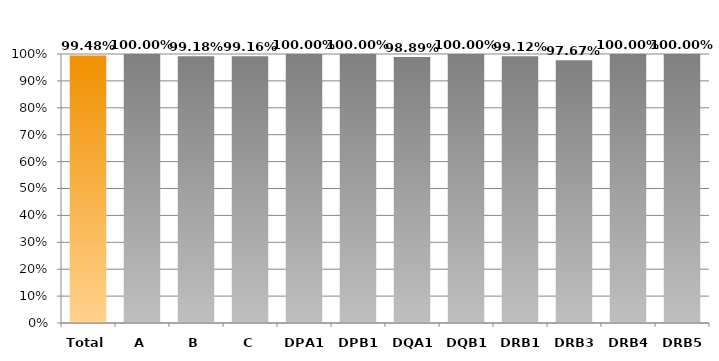
| Category | Series 0 |
|---|---|
| Total | 0.995 |
| A | 1 |
| B | 0.992 |
| C | 0.992 |
| DPA1 | 1 |
| DPB1 | 1 |
| DQA1 | 0.989 |
| DQB1 | 1 |
| DRB1 | 0.991 |
| DRB3 | 0.977 |
| DRB4 | 1 |
| DRB5 | 1 |